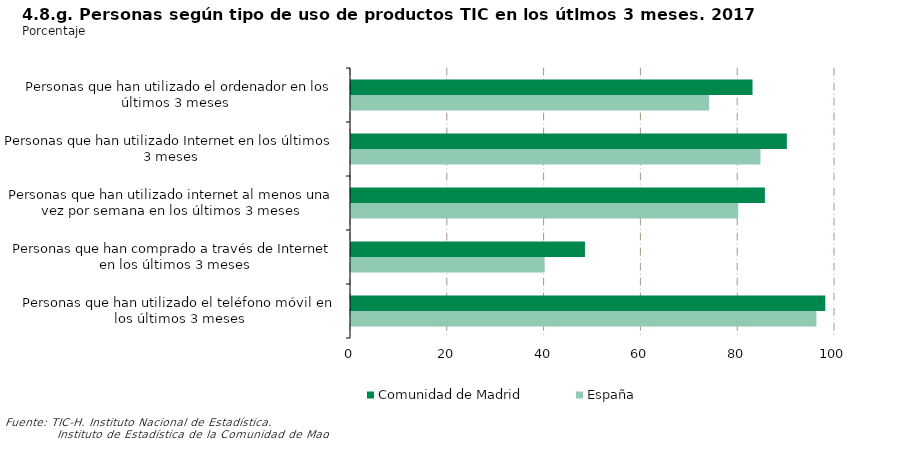
| Category | Comunidad de Madrid | España |
|---|---|---|
|    Personas que han utilizado el ordenador en los últimos 3 meses | 82.958 | 73.992 |
| Personas que han utilizado Internet en los últimos 3 meses | 90.049 | 84.602 |
| Personas que han utilizado internet al menos una vez por semana en los últimos 3 meses | 85.516 | 80.012 |
| Personas que han comprado a través de Internet en los últimos 3 meses | 48.338 | 40.016 |
| Personas que han utilizado el teléfono móvil en los últimos 3 meses | 97.998 | 96.159 |